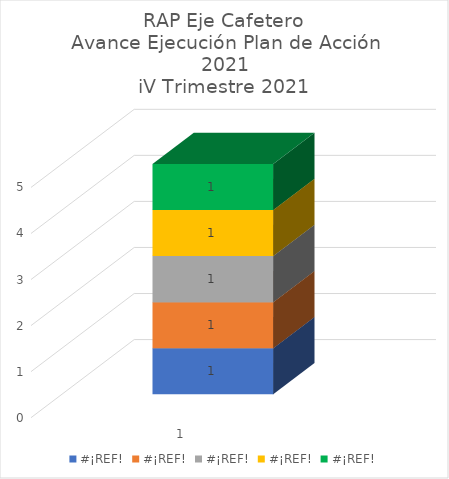
| Category | #¡REF! |
|---|---|
| 0 | 1 |